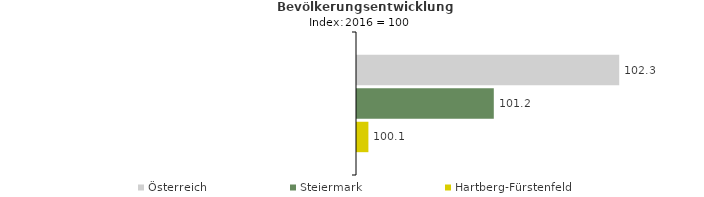
| Category | Österreich | Steiermark | Hartberg-Fürstenfeld |
|---|---|---|---|
| 2020.0 | 102.3 | 101.2 | 100.1 |